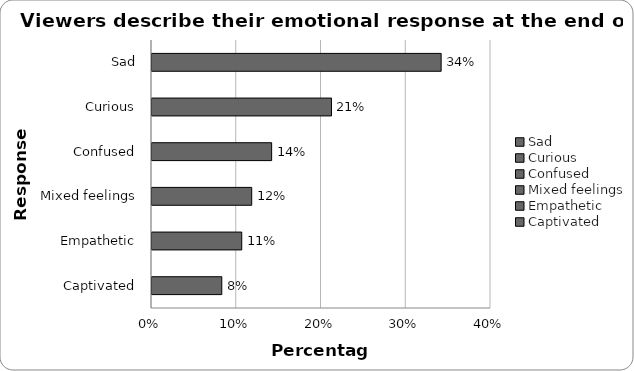
| Category | Series 0 |
|---|---|
| Sad | 0.341 |
| Curious | 0.212 |
| Confused | 0.141 |
| Mixed feelings | 0.118 |
| Empathetic | 0.106 |
| Captivated | 0.082 |